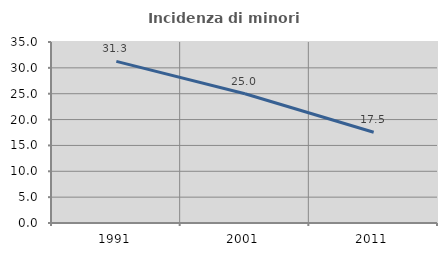
| Category | Incidenza di minori stranieri |
|---|---|
| 1991.0 | 31.25 |
| 2001.0 | 25 |
| 2011.0 | 17.544 |